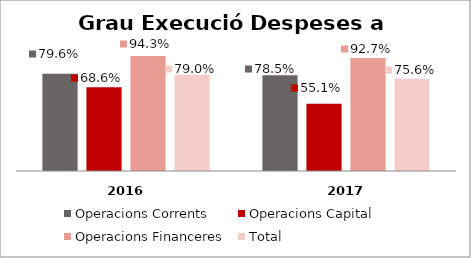
| Category | Operacions Corrents | Operacions Capital | Operacions Financeres | Total |
|---|---|---|---|---|
| 0 | 0.796 | 0.686 | 0.943 | 0.79 |
| 1 | 0.785 | 0.551 | 0.927 | 0.756 |